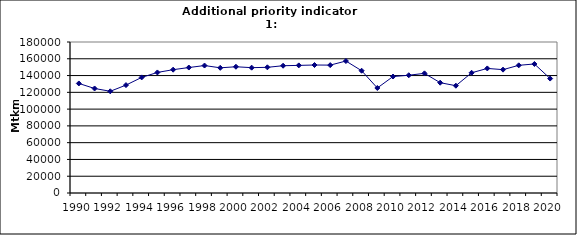
| Category | Freight transport on road, Mtkm |
|---|---|
| 1990 | 130600 |
| 1991 | 124592 |
| 1992 | 121250 |
| 1993 | 128625 |
| 1994 | 137811 |
| 1995 | 143700 |
| 1996 | 147000 |
| 1997 | 149557 |
| 1998 | 151931 |
| 1999 | 149225 |
| 2000 | 150482 |
| 2001 | 149398 |
| 2002 | 149826 |
| 2003 | 151711 |
| 2004 | 152126 |
| 2005 | 152566 |
| 2006 | 152445 |
| 2007 | 157311 |
| 2008 | 145760 |
| 2009 | 125177 |
| 2010 | 138850 |
| 2011 | 140366 |
| 2012 | 142625 |
| 2013 | 131493 |
| 2014 | 127885 |
| 2015 | 143294 |
| 2016 | 148494 |
| 2017 | 147049.432 |
| 2018 | 152200 |
| 2019 | 153800 |
| 2020 | 136400 |